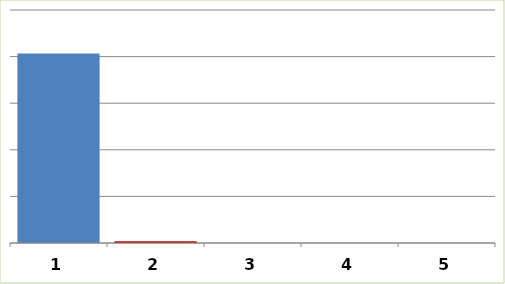
| Category | Series 0 |
|---|---|
| 0 | 2033283.25 |
| 1 | 18064.2 |
| 2 | 0 |
| 3 | 0 |
| 4 | 0 |